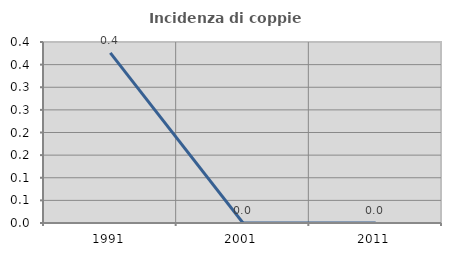
| Category | Incidenza di coppie miste |
|---|---|
| 1991.0 | 0.376 |
| 2001.0 | 0 |
| 2011.0 | 0 |